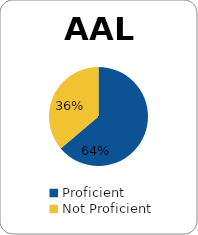
| Category | Series 0 |
|---|---|
| Proficient | 0.638 |
| Not Proficient | 0.362 |